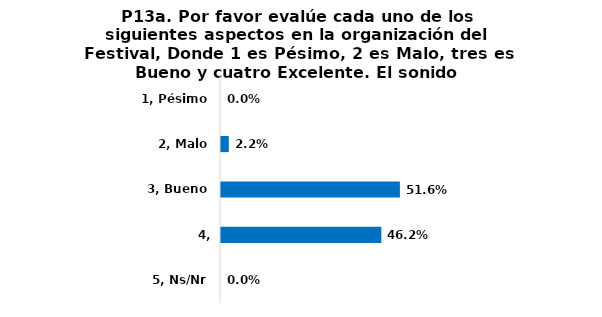
| Category | Series 0 |
|---|---|
| 1, Pésimo | 0 |
| 2, Malo | 0.022 |
| 3, Bueno | 0.516 |
| 4, Excelente | 0.462 |
| 5, Ns/Nr | 0 |